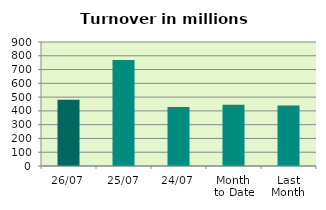
| Category | Series 0 |
|---|---|
| 26/07 | 481.129 |
| 25/07 | 769.655 |
| 24/07 | 428.253 |
| Month 
to Date | 444.291 |
| Last
Month | 439.695 |